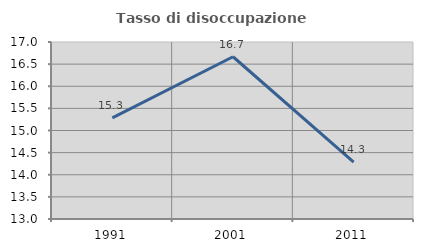
| Category | Tasso di disoccupazione giovanile  |
|---|---|
| 1991.0 | 15.287 |
| 2001.0 | 16.667 |
| 2011.0 | 14.286 |